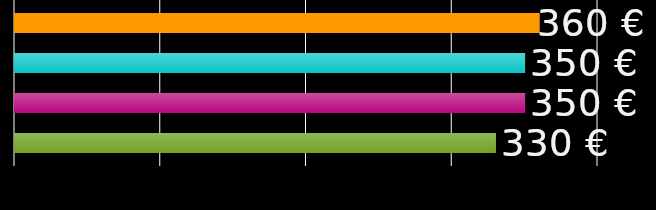
| Category | colocataire 1 | colocataire 2 | colocataire 3 | colocataire 4 |
|---|---|---|---|---|
| 0 | 360 | 350 | 350 | 330 |